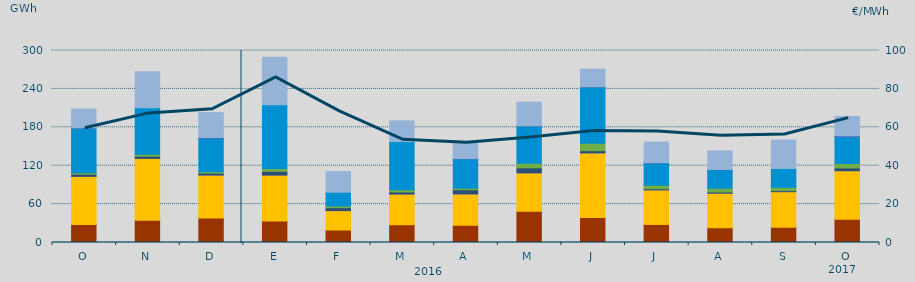
| Category | Carbón | Ciclo Combinado | Cogeneración | Consumo Bombeo | Eólica | Fuel-Gas | Hidráulica | Nuclear | Turbinación bombeo |
|---|---|---|---|---|---|---|---|---|---|
| O | 28157.6 | 75179.9 | 2.2 | 3499.1 | 2164.7 | 0 | 70061.5 | 21.9 | 29280.6 |
| N | 34938.5 | 96462 | 10.5 | 3432.1 | 3197.2 | 0 | 72313.8 | 0 | 56573.1 |
| D | 38367.5 | 66989.6 | 22.7 | 3010.5 | 2208.6 | 0 | 52585.3 | 619.5 | 39099.8 |
| E | 33693.8 | 71645.3 | 16.3 | 5899.1 | 4288.7 | 0 | 99664.7 | 0 | 74414.2 |
| F | 19518.4 | 30319.3 | 9.6 | 4595.7 | 2486.3 | 0 | 21689.9 | 0 | 32220.5 |
| M | 27782.8 | 47861.9 | 30.1 | 3279.6 | 3494.1 | 0 | 75296.7 | 0 | 32248 |
| A | 26944.8 | 48899.3 | 13.6 | 6553.1 | 2541.5 | 0 | 45882.6 | 122 | 24942.1 |
| M | 49018.7 | 59814.3 | 7.3 | 7845.9 | 7018.8 | 0 | 58284.6 | 169.5 | 36979 |
| J | 39223.4 | 100710.5 | 17.3 | 3498.8 | 11518.7 | 0 | 88256.3 | 69.8 | 27501.3 |
| J | 28227.7 | 53992.1 | 2.7 | 1736.9 | 5554.8 | 0 | 34688.7 | 310 | 32397.1 |
| A | 23185.3 | 53888.3 | 1.1 | 1823.4 | 5883.3 | 0 | 29023.6 | 148 | 29140 |
| S | 23990.4 | 55429.2 | 0.8 | 1551.4 | 5247.3 | 0 | 29358.5 | 3.1 | 44532.5 |
| O | 36235.6 | 75955.4 | 2 | 4285.9 | 7050.1 | 0 | 42190.9 | 700 | 30549.8 |